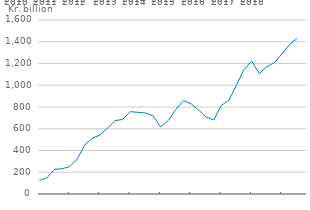
| Category | IIP |
|---|---|
| 2010-03-01 | 125.22 |
| 2010-06-01 | 148.188 |
| 2010-09-01 | 226.132 |
| 2010-12-01 | 232.256 |
| 2011-03-01 | 252.458 |
| 2011-06-01 | 319.261 |
| 2011-09-01 | 451.187 |
| 2011-12-01 | 512.523 |
| 2012-03-01 | 542.657 |
| 2012-06-01 | 604.702 |
| 2012-09-01 | 674.825 |
| 2012-12-01 | 685.518 |
| 2013-03-01 | 757.008 |
| 2013-06-01 | 751.086 |
| 2013-09-01 | 745.321 |
| 2013-12-01 | 719.851 |
| 2014-03-01 | 616.11 |
| 2014-06-01 | 674.389 |
| 2014-09-01 | 775.757 |
| 2014-12-01 | 858.461 |
| 2015-03-01 | 830.41 |
| 2015-06-01 | 773.085 |
| 2015-09-01 | 707.493 |
| 2015-12-01 | 680.113 |
| 2016-03-01 | 815.226 |
| 2016-06-01 | 861.502 |
| 2016-09-01 | 1001.671 |
| 2016-12-01 | 1145.891 |
| 2017-03-01 | 1222.156 |
| 2017-06-01 | 1107.986 |
| 2017-09-01 | 1170.08 |
| 2017-12-01 | 1207.797 |
| 2018-03-01 | 1287.142 |
| 2018-06-01 | 1375.044 |
| 2018-09-01 | 1430.87 |